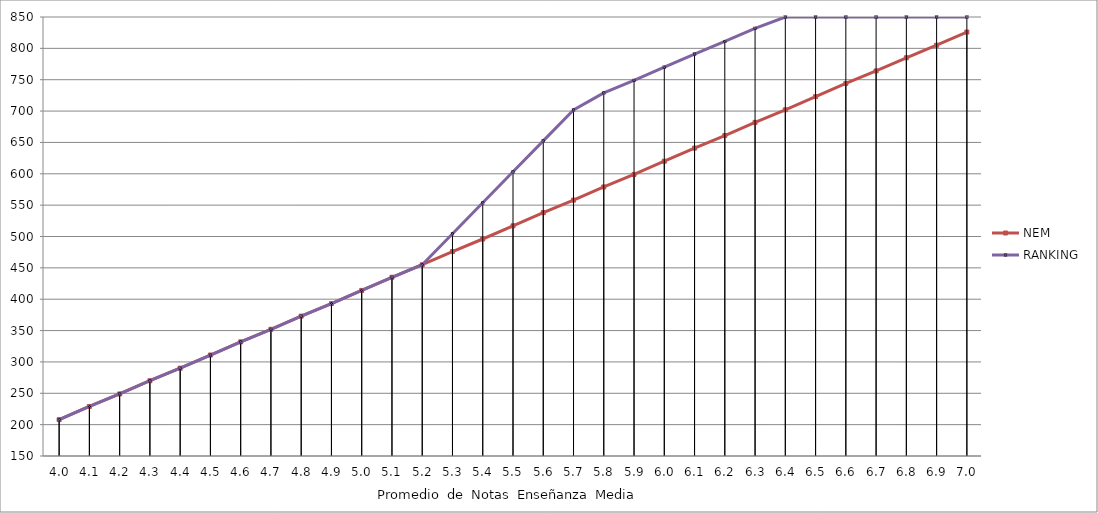
| Category | NEM | RANKING_4 | RANKING |
|---|---|---|---|
| 4.0 | 208 |  | 208 |
| 4.1 | 229 |  | 229 |
| 4.2 | 249 |  | 249 |
| 4.3 | 270 |  | 270 |
| 4.4 | 290 |  | 290 |
| 4.5 | 311 |  | 311 |
| 4.6 | 332 |  | 332 |
| 4.7 | 352 |  | 352 |
| 4.8 | 373 |  | 373 |
| 4.9 | 393 |  | 393 |
| 5.0 | 414 |  | 414 |
| 5.1 | 435 |  | 435 |
| 5.2 | 455 |  | 455 |
| 5.3 | 476 |  | 504.375 |
| 5.4 | 496 |  | 553.75 |
| 5.5 | 517 |  | 603.125 |
| 5.6 | 538 |  | 652.5 |
| 5.7 | 558 |  | 701.875 |
| 5.8 | 579 |  | 729 |
| 5.9 | 599 |  | 749 |
| 6.0 | 620 |  | 770 |
| 6.1 | 641 |  | 791 |
| 6.2 | 661 |  | 811 |
| 6.3 | 682 |  | 832 |
| 6.4 | 702 |  | 850 |
| 6.5 | 723 |  | 850 |
| 6.6 | 744 |  | 850 |
| 6.7 | 764 |  | 850 |
| 6.8 | 785 |  | 850 |
| 6.9 | 805 |  | 850 |
| 7.0 | 826 |  | 850 |